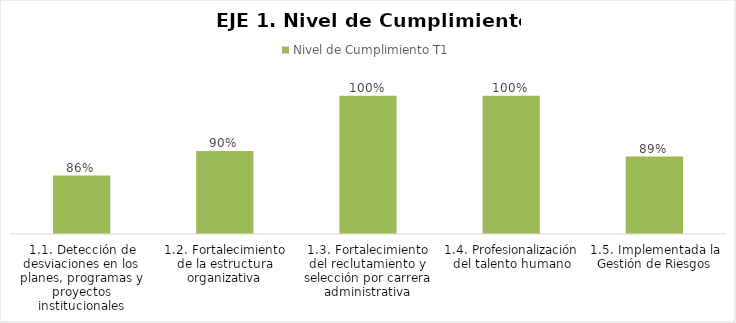
| Category | Nivel de Cumplimiento T1 |
|---|---|
| 1.1. Detección de desviaciones en los planes, programas y proyectos institucionales | 0.856 |
| 1.2. Fortalecimiento de la estructura organizativa | 0.9 |
| 1.3. Fortalecimiento del reclutamiento y selección por carrera administrativa | 1 |
| 1.4. Profesionalización del talento humano | 1 |
| 1.5. Implementada la Gestión de Riesgos | 0.89 |